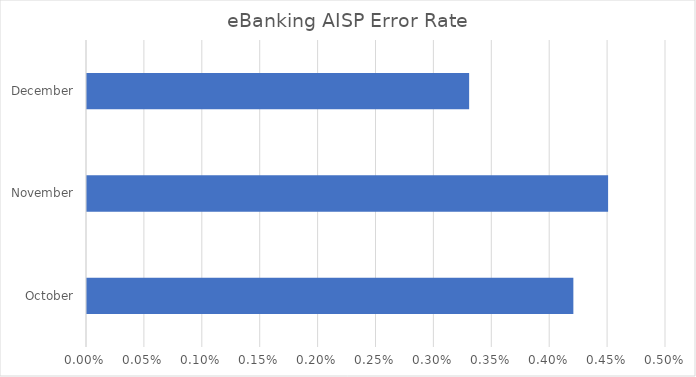
| Category | eBanking |
|---|---|
| October | 0.004 |
| November | 0.004 |
| December | 0.003 |